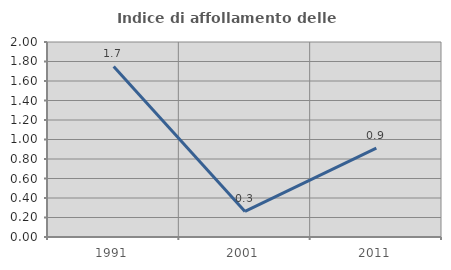
| Category | Indice di affollamento delle abitazioni  |
|---|---|
| 1991.0 | 1.749 |
| 2001.0 | 0.262 |
| 2011.0 | 0.912 |